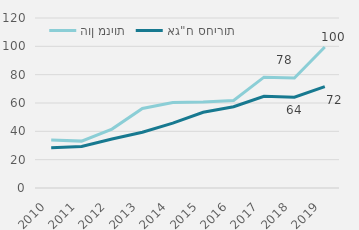
| Category | הון מניות | אג"ח סחירות |
|---|---|---|
| 2010 | 33827.938 | 28412.19 |
| 2011 | 33092.585 | 29272.682 |
| 2012 | 41590.769 | 34535.708 |
| 2013 | 56166.195 | 39353.473 |
| 2014 | 60415.364 | 45757.894 |
| 2015 | 60621.101 | 53480.796 |
| 2016 | 61779.331 | 57368.679 |
| 2017 | 78224.236 | 64765.974 |
| 2018 | 77649.356 | 64054.856 |
| 2019 | 99573 | 71539 |